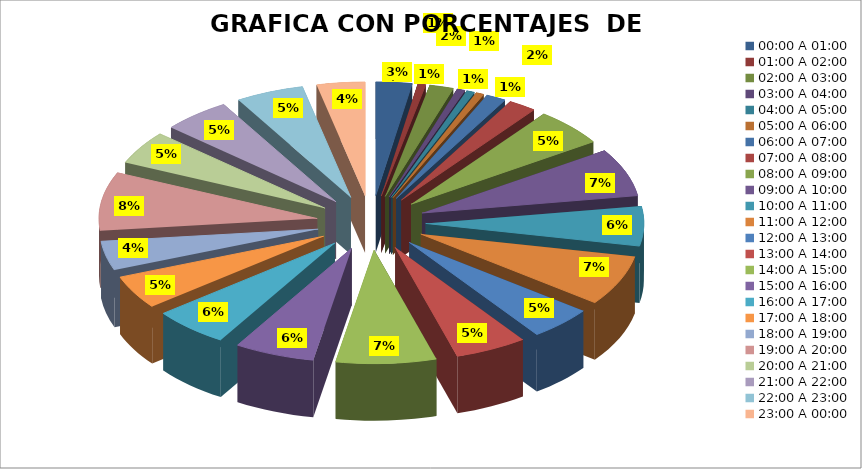
| Category | COMPUTO |
|---|---|
| 00:00 A 01:00 | 9 |
| 01:00 A 02:00 | 2 |
| 02:00 A 03:00 | 6 |
| 03:00 A 04:00 | 2 |
| 04:00 A 05:00 | 2 |
| 05:00 A 06:00 | 2 |
| 06:00 A 07:00 | 5 |
| 07:00 A 08:00 | 7 |
| 08:00 A 09:00 | 18 |
| 09:00 A 10:00 | 23 |
| 10:00 A 11:00 | 19 |
| 11:00 A 12:00 | 24 |
| 12:00 A 13:00 | 16 |
| 13:00 A 14:00 | 18 |
| 14:00 A 15:00 | 25 |
| 15:00 A 16:00 | 20 |
| 16:00 A 17:00 | 19 |
| 17:00 A 18:00 | 16 |
| 18:00 A 19:00 | 14 |
| 19:00 A 20:00 | 28 |
| 20:00 A 21:00 | 16 |
| 21:00 A 22:00 | 17 |
| 22:00 A 23:00 | 17 |
| 23:00 A 00:00 | 12 |